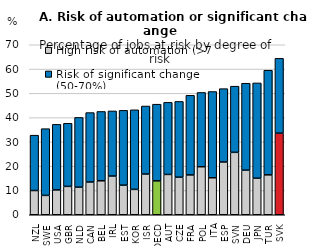
| Category | High risk of automation (>70%) | Risk of significant change (50-70%) |
|---|---|---|
| NZL | 9.975 | 22.795 |
| SWE | 7.975 | 27.469 |
| USA | 10.232 | 26.998 |
| GBR | 11.683 | 25.999 |
| NLD | 11.37 | 28.701 |
| CAN | 13.487 | 28.587 |
| BEL | 13.988 | 28.544 |
| IRL | 15.944 | 26.804 |
| EST | 12.18 | 30.817 |
| KOR | 10.444 | 32.767 |
| ISR | 16.77 | 28.005 |
| OECD | 13.957 | 31.572 |
| AUT | 16.605 | 29.678 |
| CZE | 15.464 | 31.199 |
| FRA | 16.404 | 32.781 |
| POL | 19.775 | 30.577 |
| ITA | 15.234 | 35.506 |
| ESP | 21.736 | 30.191 |
| SVN | 25.7 | 27.249 |
| DEU | 18.367 | 35.794 |
| JPN | 15.053 | 39.23 |
| TUR | 16.43 | 43.086 |
| SVK | 33.604 | 30.809 |